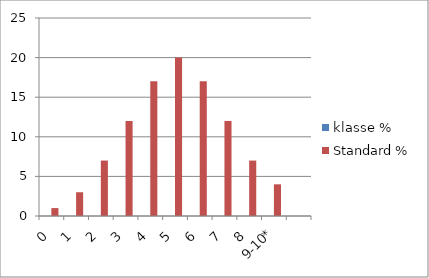
| Category | klasse % | Standard % |
|---|---|---|
| 0 | 0 | 1 |
| 1 | 0 | 3 |
| 2 | 0 | 7 |
| 3 | 0 | 12 |
| 4 | 0 | 17 |
| 5 | 0 | 20 |
| 6 | 0 | 17 |
| 7 | 0 | 12 |
| 8 | 0 | 7 |
| 9-10* | 0 | 4 |